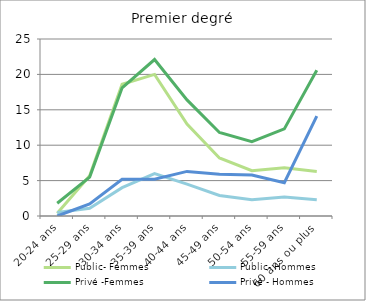
| Category | Public- Femmes | Public- Hommes | Privé -Femmes | Privé - Hommes |
|---|---|---|---|---|
| 20-24 ans | 0.4 | 0.5 | 1.8 | 0 |
| 25-29 ans | 5.7 | 1.1 | 5.5 | 1.7 |
| 30-34 ans | 18.6 | 4 | 18.1 | 5.2 |
| 35-39 ans | 20 | 6 | 22.1 | 5.2 |
| 40-44 ans | 13 | 4.5 | 16.4 | 6.3 |
| 45-49 ans | 8.2 | 2.9 | 11.8 | 5.9 |
| 50-54 ans | 6.4 | 2.3 | 10.5 | 5.8 |
| 55-59 ans | 6.8 | 2.7 | 12.3 | 4.7 |
| 60 ans ou plus | 6.3 | 2.3 | 20.6 | 14.1 |